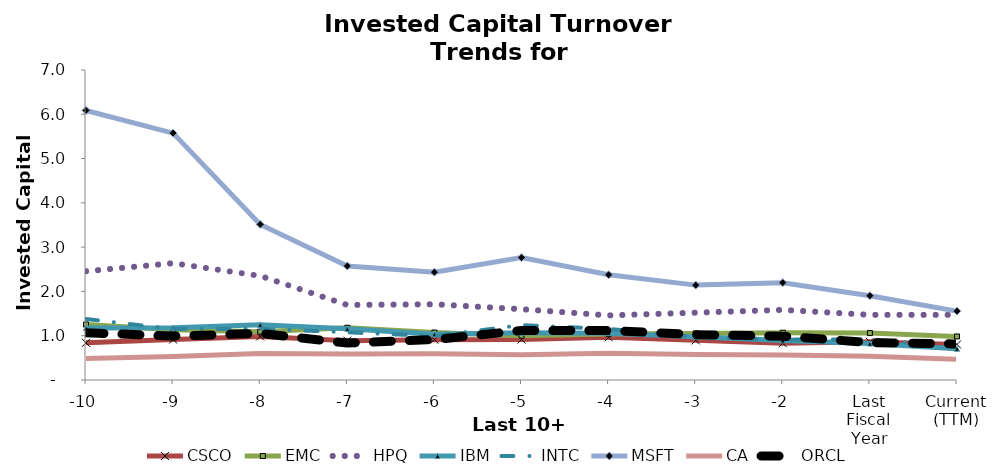
| Category | CSCO | EMC | HPQ | IBM | INTC | MSFT | CA | ORCL |
|---|---|---|---|---|---|---|---|---|
| -10 | 0.839 | 1.254 | 2.455 | 1.174 | 1.378 | 6.086 | 0.484 | 1.067 |
| -9 | 0.912 | 1.135 | 2.638 | 1.179 | 1.15 | 5.575 | 0.531 | 0.992 |
| -8 | 0.984 | 1.092 | 2.351 | 1.246 | 1.156 | 3.513 | 0.598 | 1.052 |
| -7 | 0.888 | 1.18 | 1.694 | 1.155 | 1.077 | 2.575 | 0.584 | 0.834 |
| -6 | 0.911 | 1.072 | 1.71 | 1.031 | 0.992 | 2.435 | 0.594 | 0.914 |
| -5 | 0.915 | 0.999 | 1.599 | 1.066 | 1.239 | 2.764 | 0.57 | 1.117 |
| -4 | 0.963 | 1.04 | 1.459 | 1.058 | 1.154 | 2.375 | 0.604 | 1.118 |
| -3 | 0.895 | 1.053 | 1.52 | 0.977 | 0.972 | 2.142 | 0.576 | 1.025 |
| -2 | 0.829 | 1.069 | 1.583 | 0.894 | 0.91 | 2.198 | 0.565 | 0.99 |
| Last Fiscal Year | 0.863 | 1.06 | 1.471 | 0.822 | 0.922 | 1.904 | 0.534 | 0.846 |
| Current (TTM) | 0.803 | 0.983 | 1.471 | 0.706 | 0.742 | 1.555 | 0.469 | 0.814 |